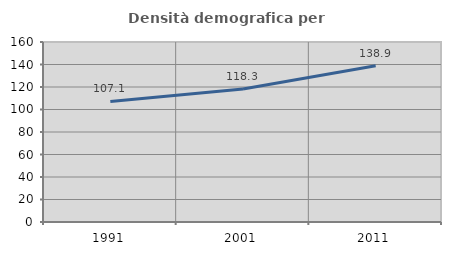
| Category | Densità demografica |
|---|---|
| 1991.0 | 107.118 |
| 2001.0 | 118.251 |
| 2011.0 | 138.95 |